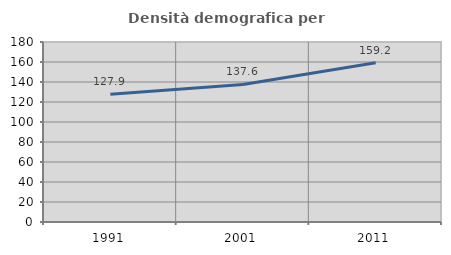
| Category | Densità demografica |
|---|---|
| 1991.0 | 127.856 |
| 2001.0 | 137.596 |
| 2011.0 | 159.241 |